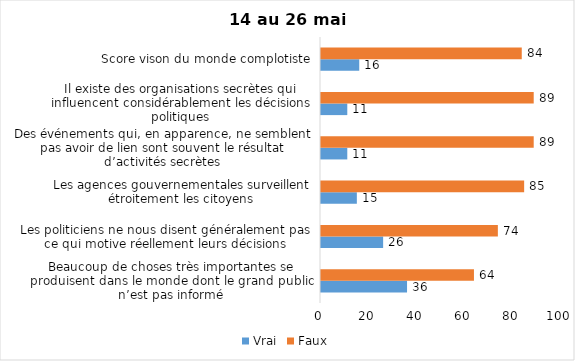
| Category | Vrai | Faux |
|---|---|---|
| Beaucoup de choses très importantes se produisent dans le monde dont le grand public n’est pas informé | 36 | 64 |
| Les politiciens ne nous disent généralement pas ce qui motive réellement leurs décisions | 26 | 74 |
| Les agences gouvernementales surveillent étroitement les citoyens | 15 | 85 |
| Des événements qui, en apparence, ne semblent pas avoir de lien sont souvent le résultat d’activités secrètes | 11 | 89 |
| Il existe des organisations secrètes qui influencent considérablement les décisions politiques | 11 | 89 |
| Score vison du monde complotiste | 16 | 84 |